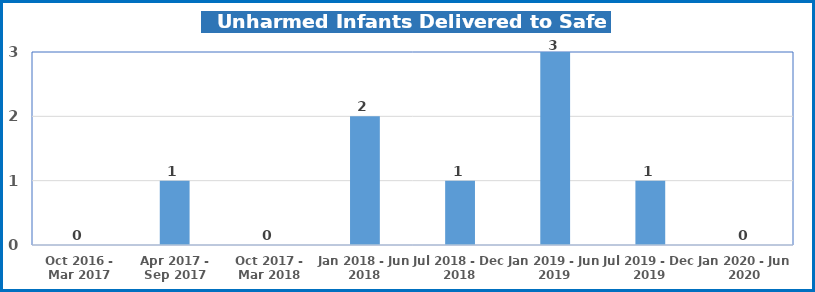
| Category | Infants Delivered to Safe Haven |
|---|---|
| Oct 2016 - Mar 2017 | 0 |
| Apr 2017 - Sep 2017 | 1 |
| Oct 2017 - Mar 2018 | 0 |
| Jan 2018 - Jun 2018 | 2 |
| Jul 2018 - Dec 2018 | 1 |
| Jan 2019 - Jun 2019 | 3 |
| Jul 2019 - Dec 2019 | 1 |
| Jan 2020 - Jun 2020 | 0 |